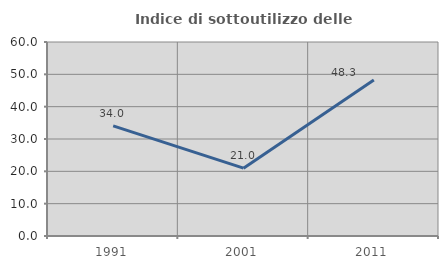
| Category | Indice di sottoutilizzo delle abitazioni  |
|---|---|
| 1991.0 | 34.043 |
| 2001.0 | 20.988 |
| 2011.0 | 48.276 |